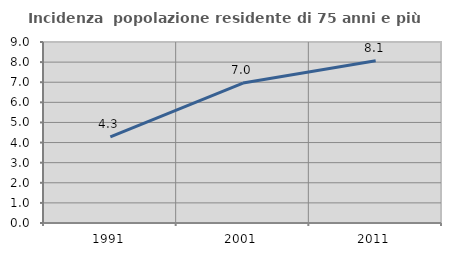
| Category | Incidenza  popolazione residente di 75 anni e più |
|---|---|
| 1991.0 | 4.278 |
| 2001.0 | 6.958 |
| 2011.0 | 8.067 |